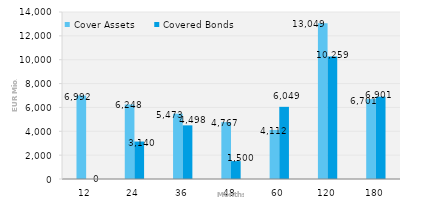
| Category | Cover Assets | Covered Bonds |
|---|---|---|
| 12.0 | 6991.9 | 0 |
| 24.0 | 6247.791 | 3140.1 |
| 36.0 | 5473.077 | 4497.622 |
| 48.0 | 4766.882 | 1500 |
| 60.0 | 4111.665 | 6049.4 |
| 120.0 | 13049.301 | 10259.315 |
| 180.0 | 6701.245 | 6900.9 |